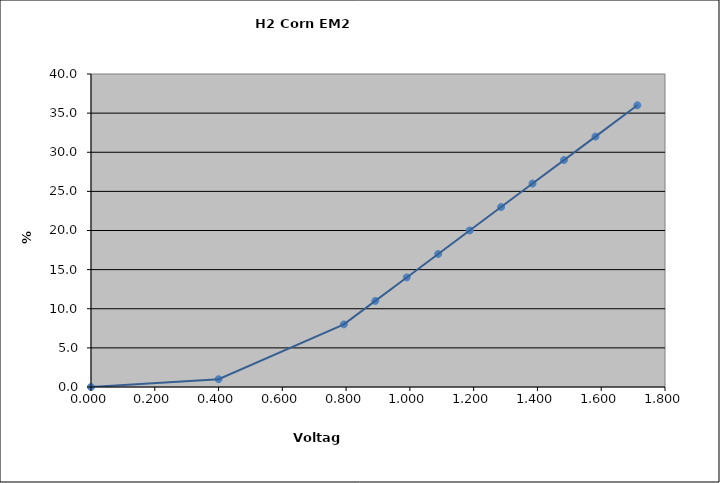
| Category | Generated Curve |
|---|---|
| 0.0 | 0 |
| 0.4 | 1 |
| 0.793 | 8 |
| 0.8916000000000001 | 11 |
| 0.9902000000000001 | 14 |
| 1.0888000000000002 | 17 |
| 1.1874000000000002 | 20 |
| 1.2860000000000003 | 23 |
| 1.3846000000000003 | 26 |
| 1.4832 | 29 |
| 1.5818 | 32 |
| 1.713266666666667 | 36 |